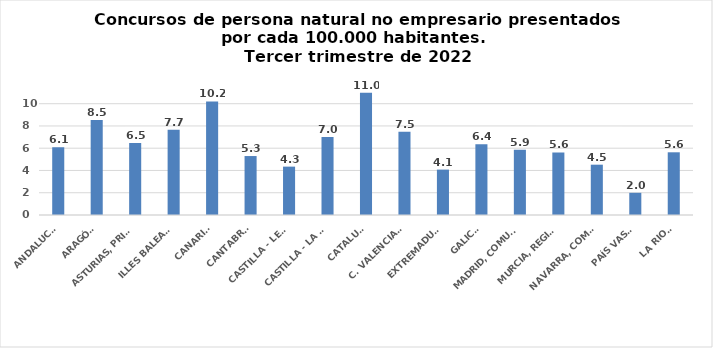
| Category | Series 0 |
|---|---|
| ANDALUCÍA | 6.084 |
| ARAGÓN | 8.526 |
| ASTURIAS, PRINCIPADO | 6.471 |
| ILLES BALEARS | 7.651 |
| CANARIAS | 10.2 |
| CANTABRIA | 5.297 |
| CASTILLA - LEÓN | 4.346 |
| CASTILLA - LA MANCHA | 7.017 |
| CATALUÑA | 10.985 |
| C. VALENCIANA | 7.484 |
| EXTREMADURA | 4.079 |
| GALICIA | 6.359 |
| MADRID, COMUNIDAD | 5.857 |
| MURCIA, REGIÓN | 5.616 |
| NAVARRA, COM. FORAL | 4.521 |
| PAÍS VASCO | 1.993 |
| LA RIOJA | 5.634 |